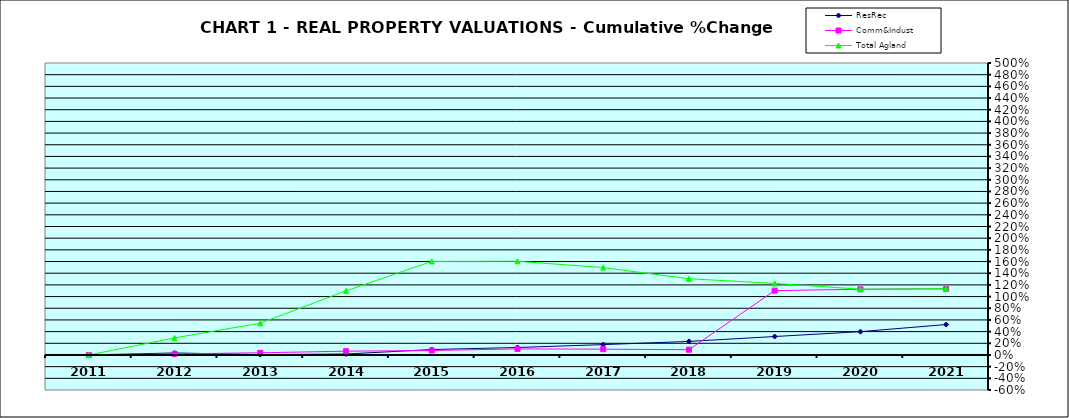
| Category | ResRec | Comm&Indust | Total Agland |
|---|---|---|---|
| 2011.0 | 0 | 0 | 0 |
| 2012.0 | 0.034 | 0.018 | 0.292 |
| 2013.0 | 0.007 | 0.037 | 0.545 |
| 2014.0 | 0.016 | 0.065 | 1.098 |
| 2015.0 | 0.093 | 0.076 | 1.602 |
| 2016.0 | 0.128 | 0.104 | 1.605 |
| 2017.0 | 0.177 | 0.099 | 1.496 |
| 2018.0 | 0.232 | 0.09 | 1.305 |
| 2019.0 | 0.316 | 1.102 | 1.225 |
| 2020.0 | 0.399 | 1.126 | 1.127 |
| 2021.0 | 0.521 | 1.132 | 1.136 |